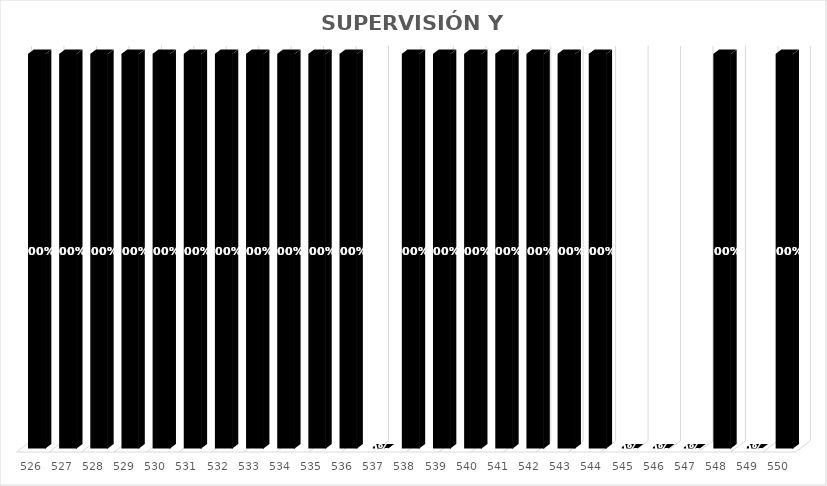
| Category | % Avance |
|---|---|
| 526.0 | 1 |
| 527.0 | 1 |
| 528.0 | 1 |
| 529.0 | 1 |
| 530.0 | 1 |
| 531.0 | 1 |
| 532.0 | 1 |
| 533.0 | 1 |
| 534.0 | 1 |
| 535.0 | 1 |
| 536.0 | 1 |
| 537.0 | 0 |
| 538.0 | 1 |
| 539.0 | 1 |
| 540.0 | 1 |
| 541.0 | 1 |
| 542.0 | 1 |
| 543.0 | 1 |
| 544.0 | 1 |
| 545.0 | 0 |
| 546.0 | 0 |
| 547.0 | 0 |
| 548.0 | 1 |
| 549.0 | 0 |
| 550.0 | 1 |